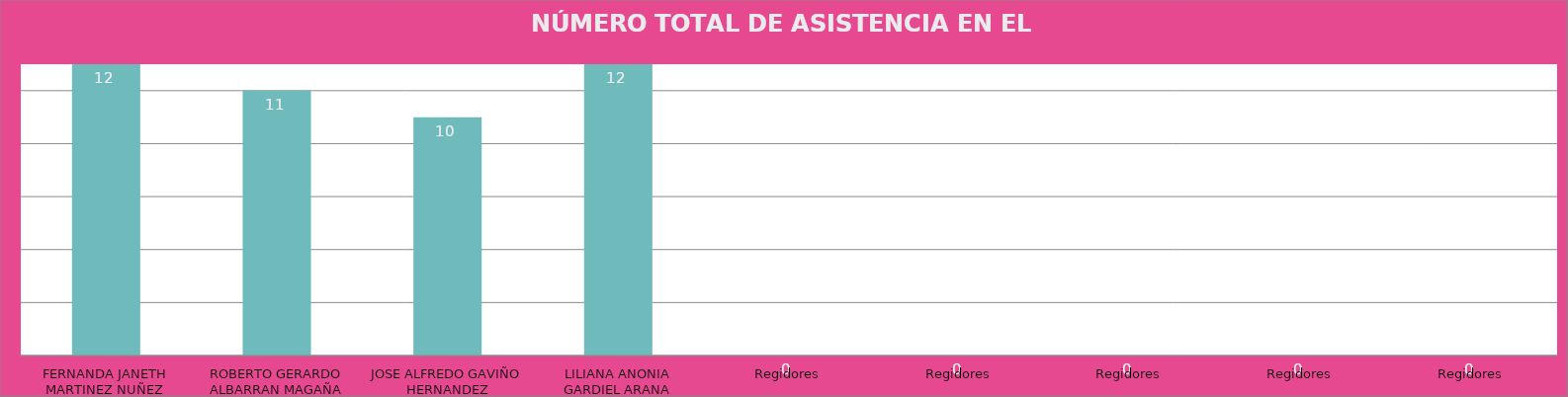
| Category | FERNANDA JANETH MARTINEZ NUÑEZ |
|---|---|
| FERNANDA JANETH MARTINEZ NUÑEZ | 12 |
| ROBERTO GERARDO ALBARRAN MAGAÑA | 11 |
| JOSE ALFREDO GAVIÑO HERNANDEZ | 10 |
| LILIANA ANONIA GARDIEL ARANA | 12 |
| Regidores | 0 |
| Regidores | 0 |
| Regidores | 0 |
| Regidores | 0 |
| Regidores | 0 |